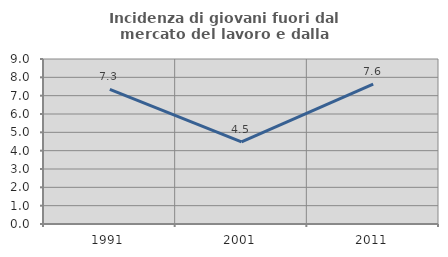
| Category | Incidenza di giovani fuori dal mercato del lavoro e dalla formazione  |
|---|---|
| 1991.0 | 7.345 |
| 2001.0 | 4.478 |
| 2011.0 | 7.631 |